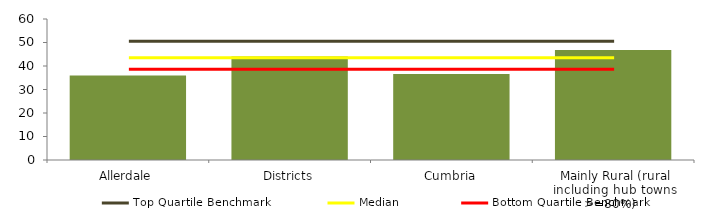
| Category | Block Data |
|---|---|
| Allerdale | 36 |
| Districts | 44.036 |
| Cumbria | 36.6 |
|  Mainly Rural (rural including hub towns >=80%)   | 46.857 |